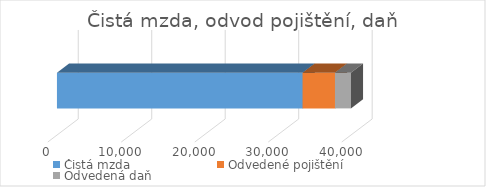
| Category | Čistá mzda | Odvedené pojištění | Odvedená daň |
|---|---|---|---|
| 2163.0 | 33437 | 4400 | 2163 |